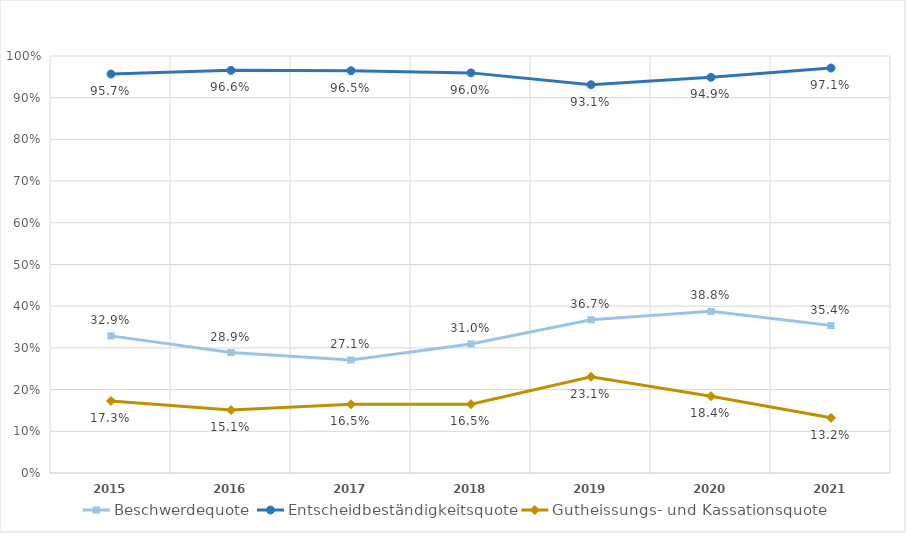
| Category | Beschwerdequote | Entscheidbeständigkeitsquote | Gutheissungs- und Kassationsquote |
|---|---|---|---|
| 2015.0 | 0.329 | 0.957 | 0.173 |
| 2016.0 | 0.289 | 0.966 | 0.151 |
| 2017.0 | 0.271 | 0.965 | 0.165 |
| 2018.0 | 0.31 | 0.96 | 0.165 |
| 2019.0 | 0.367 | 0.931 | 0.231 |
| 2020.0 | 0.388 | 0.949 | 0.184 |
| 2021.0 | 0.354 | 0.971 | 0.132 |